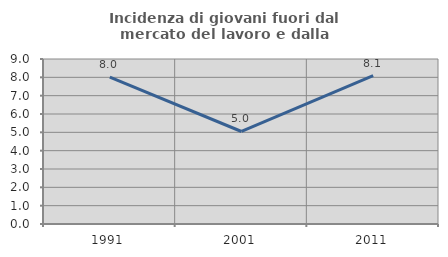
| Category | Incidenza di giovani fuori dal mercato del lavoro e dalla formazione  |
|---|---|
| 1991.0 | 8.017 |
| 2001.0 | 5.046 |
| 2011.0 | 8.095 |